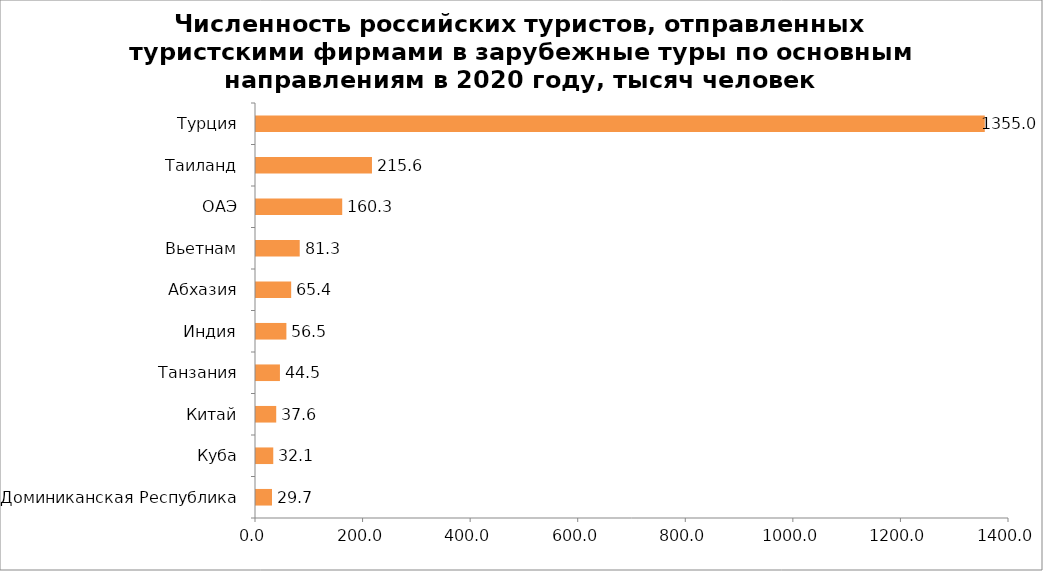
| Category | Series 0 |
|---|---|
| Доминиканская Республика | 29.7 |
| Куба | 32.1 |
| Китай | 37.6 |
| Танзания | 44.5 |
| Индия | 56.5 |
| Абхазия | 65.4 |
| Вьетнам | 81.3 |
| ОАЭ | 160.3 |
| Таиланд | 215.6 |
| Турция | 1355 |